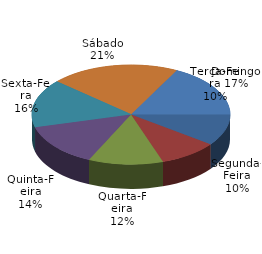
| Category | Qtde Acidentes |
|---|---|
| Segunda-Feira | 156 |
| Terça-Feira | 147 |
| Quarta-Feira | 186 |
| Quinta-Feira | 214 |
| Sexta-Feira | 239 |
| Sábado | 323 |
| Domingo | 266 |